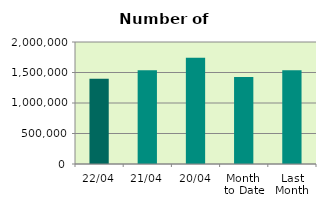
| Category | Series 0 |
|---|---|
| 22/04 | 1395642 |
| 21/04 | 1537350 |
| 20/04 | 1741634 |
| Month 
to Date | 1426223.714 |
| Last
Month | 1535393.739 |